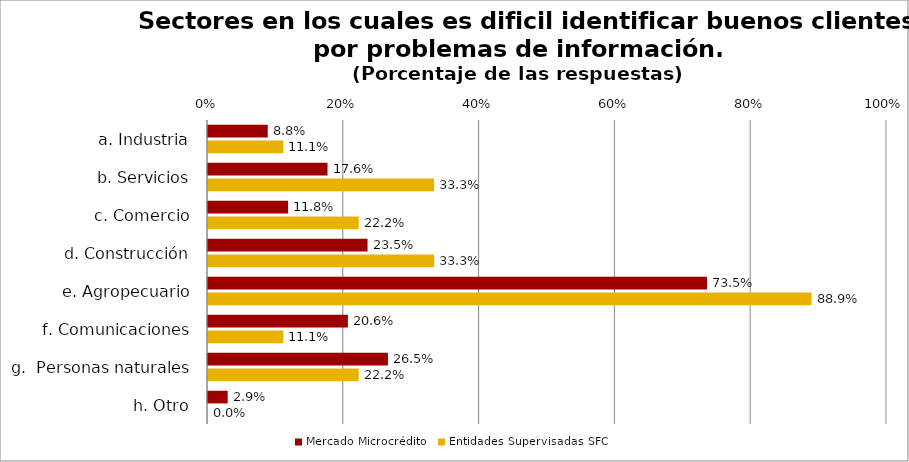
| Category | Mercado Microcrédito | Entidades Supervisadas SFC |
|---|---|---|
| a. Industria | 0.088 | 0.111 |
| b. Servicios | 0.176 | 0.333 |
| c. Comercio | 0.118 | 0.222 |
| d. Construcción | 0.235 | 0.333 |
| e. Agropecuario | 0.735 | 0.889 |
| f. Comunicaciones | 0.206 | 0.111 |
| g.  Personas naturales | 0.265 | 0.222 |
| h. Otro | 0.029 | 0 |